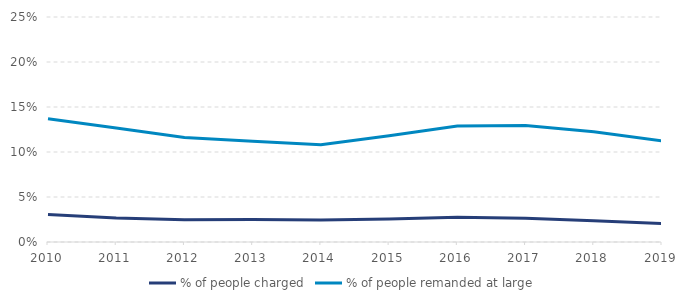
| Category | % of people charged | % of people remanded at large |
|---|---|---|
| 2010.0 | 0.03 | 0.137 |
| 2011.0 | 0.027 | 0.127 |
| 2012.0 | 0.025 | 0.116 |
| 2013.0 | 0.025 | 0.112 |
| 2014.0 | 0.024 | 0.108 |
| 2015.0 | 0.025 | 0.118 |
| 2016.0 | 0.027 | 0.129 |
| 2017.0 | 0.026 | 0.129 |
| 2018.0 | 0.023 | 0.122 |
| 2019.0 | 0.021 | 0.112 |